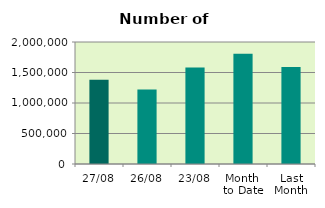
| Category | Series 0 |
|---|---|
| 27/08 | 1380750 |
| 26/08 | 1221386 |
| 23/08 | 1580208 |
| Month 
to Date | 1808927.263 |
| Last
Month | 1591495.826 |